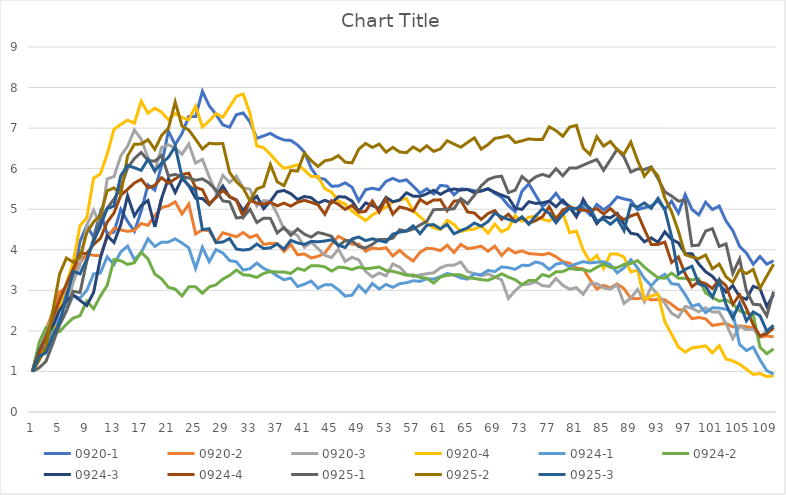
| Category | 0920-1 | 0920-2 | 0920-3 | 0920-4 | 0924-1 | 0924-2 | 0924-3 | 0924-4 | 0925-1 | 0925-2 | 0925-3 |
|---|---|---|---|---|---|---|---|---|---|---|---|
| 0 | 1 | 1 | 1 | 1 | 1 | 1 | 1 | 1 | 1 | 1 | 1 |
| 1 | 1.642 | 1.479 | 1.598 | 1.328 | 1.527 | 1.72 | 1.515 | 1.451 | 1.091 | 1.274 | 1.366 |
| 2 | 1.899 | 2.027 | 1.982 | 1.639 | 1.628 | 2.081 | 1.838 | 1.852 | 1.249 | 1.607 | 1.463 |
| 3 | 1.976 | 2.464 | 2.353 | 1.925 | 2.121 | 2.022 | 2.127 | 2.322 | 1.688 | 2.492 | 1.876 |
| 4 | 2.56 | 2.956 | 2.565 | 2.601 | 2.317 | 1.982 | 2.515 | 2.763 | 2.144 | 3.401 | 2.221 |
| 5 | 2.95 | 3.071 | 2.609 | 3.165 | 2.497 | 2.162 | 2.735 | 3.155 | 2.487 | 3.797 | 2.807 |
| 6 | 3.232 | 3.414 | 3.195 | 3.687 | 2.869 | 2.316 | 2.886 | 3.525 | 2.974 | 3.694 | 3.471 |
| 7 | 4.208 | 3.683 | 3.629 | 4.592 | 2.809 | 2.374 | 2.752 | 3.902 | 2.946 | 3.823 | 3.405 |
| 8 | 4.599 | 3.891 | 4.602 | 4.789 | 3 | 2.734 | 2.628 | 3.913 | 3.719 | 4.42 | 3.769 |
| 9 | 4.309 | 3.864 | 4.975 | 5.766 | 3.405 | 2.544 | 2.945 | 4.132 | 4.272 | 4.686 | 4.209 |
| 10 | 4.931 | 3.854 | 4.603 | 5.872 | 3.428 | 2.858 | 3.794 | 4.279 | 4.713 | 4.849 | 4.583 |
| 11 | 4.4 | 4.303 | 5.748 | 6.358 | 3.825 | 3.121 | 4.349 | 4.683 | 5.026 | 5.453 | 5.016 |
| 12 | 4.435 | 4.531 | 5.804 | 6.969 | 3.636 | 3.76 | 4.18 | 4.908 | 5.249 | 5.526 | 5.08 |
| 13 | 4.999 | 4.489 | 6.317 | 7.091 | 3.947 | 3.728 | 4.622 | 5.343 | 5.533 | 5.375 | 5.828 |
| 14 | 4.699 | 4.453 | 6.554 | 7.197 | 4.091 | 3.64 | 5.333 | 5.492 | 6.02 | 6.315 | 6.079 |
| 15 | 4.456 | 4.479 | 6.954 | 7.119 | 3.756 | 3.682 | 4.835 | 5.646 | 6.249 | 6.603 | 6.022 |
| 16 | 4.952 | 4.648 | 6.728 | 7.664 | 3.931 | 3.939 | 5.091 | 5.738 | 6.4 | 6.606 | 5.959 |
| 17 | 5.602 | 4.602 | 6.267 | 7.366 | 4.269 | 3.776 | 5.215 | 5.527 | 6.203 | 6.715 | 6.23 |
| 18 | 5.474 | 4.848 | 5.935 | 7.491 | 4.082 | 3.402 | 4.565 | 5.588 | 6.185 | 6.476 | 5.945 |
| 19 | 6.09 | 5.042 | 6.521 | 7.393 | 4.188 | 3.282 | 5.27 | 5.778 | 6.322 | 6.819 | 6.135 |
| 20 | 6.928 | 5.083 | 6.588 | 7.206 | 4.189 | 3.073 | 5.761 | 5.641 | 5.825 | 6.996 | 6.278 |
| 21 | 6.589 | 5.181 | 6.509 | 7.36 | 4.269 | 3.031 | 5.412 | 5.748 | 5.857 | 7.645 | 6.549 |
| 22 | 6.866 | 4.883 | 6.355 | 7.26 | 4.167 | 2.86 | 5.761 | 5.856 | 5.806 | 7.053 | 5.798 |
| 23 | 7.288 | 5.128 | 6.608 | 7.203 | 4.047 | 3.089 | 5.582 | 5.889 | 5.769 | 6.954 | 5.576 |
| 24 | 7.284 | 4.39 | 6.138 | 7.543 | 3.541 | 3.087 | 5.273 | 5.538 | 5.715 | 6.725 | 5.469 |
| 25 | 7.907 | 4.49 | 6.231 | 7.028 | 4.063 | 2.928 | 5.264 | 5.482 | 5.749 | 6.483 | 4.498 |
| 26 | 7.552 | 4.468 | 5.8 | 7.18 | 3.705 | 3.085 | 5.111 | 5.133 | 5.645 | 6.627 | 4.519 |
| 27 | 7.337 | 4.192 | 5.413 | 7.357 | 4.004 | 3.135 | 5.301 | 5.291 | 5.468 | 6.612 | 4.178 |
| 28 | 7.08 | 4.42 | 5.834 | 7.269 | 3.923 | 3.277 | 5.572 | 5.464 | 5.204 | 6.621 | 4.191 |
| 29 | 7.021 | 4.37 | 5.659 | 7.522 | 3.733 | 3.368 | 5.304 | 5.313 | 5.182 | 5.906 | 4.277 |
| 30 | 7.332 | 4.319 | 5.816 | 7.784 | 3.703 | 3.502 | 5.23 | 5.218 | 4.786 | 5.677 | 4.018 |
| 31 | 7.374 | 4.426 | 5.526 | 7.841 | 3.499 | 3.384 | 4.965 | 4.817 | 4.801 | 5.519 | 3.993 |
| 32 | 7.15 | 4.303 | 5.495 | 7.366 | 3.534 | 3.368 | 5.193 | 5.22 | 4.998 | 5.208 | 4.014 |
| 33 | 6.747 | 4.367 | 5.076 | 6.562 | 3.674 | 3.32 | 5.32 | 5.15 | 4.672 | 5.5 | 4.143 |
| 34 | 6.808 | 4.135 | 5.213 | 6.519 | 3.54 | 3.415 | 5.014 | 5.125 | 4.778 | 5.564 | 4.03 |
| 35 | 6.871 | 4.156 | 5.196 | 6.353 | 3.469 | 3.464 | 5.194 | 5.172 | 4.774 | 6.101 | 4.047 |
| 36 | 6.772 | 4.156 | 4.882 | 6.163 | 3.356 | 3.453 | 5.429 | 5.083 | 4.417 | 5.676 | 4.143 |
| 37 | 6.707 | 3.959 | 4.505 | 6.004 | 3.26 | 3.452 | 5.462 | 5.151 | 4.551 | 5.581 | 4.017 |
| 38 | 6.696 | 4.131 | 4.443 | 6.046 | 3.301 | 3.417 | 5.383 | 5.077 | 4.355 | 5.955 | 4.233 |
| 39 | 6.583 | 3.877 | 4.351 | 6.095 | 3.094 | 3.542 | 5.239 | 5.174 | 4.515 | 5.94 | 4.169 |
| 40 | 6.408 | 3.898 | 4.062 | 5.965 | 3.152 | 3.493 | 5.314 | 5.22 | 4.384 | 6.384 | 4.132 |
| 41 | 6.009 | 3.798 | 4.187 | 5.808 | 3.228 | 3.609 | 5.285 | 5.169 | 4.312 | 6.199 | 4.207 |
| 42 | 5.773 | 3.838 | 4.03 | 5.809 | 3.053 | 3.607 | 5.147 | 5.111 | 4.427 | 6.055 | 4.197 |
| 43 | 5.739 | 3.919 | 3.863 | 5.505 | 3.139 | 3.58 | 5.221 | 4.875 | 4.386 | 6.194 | 4.217 |
| 44 | 5.568 | 4.141 | 3.807 | 5.421 | 3.136 | 3.473 | 5.156 | 5.212 | 4.332 | 6.228 | 4.245 |
| 45 | 5.573 | 4.333 | 4.017 | 5.203 | 3.015 | 3.573 | 5.31 | 5.12 | 4.093 | 6.322 | 4.113 |
| 46 | 5.652 | 4.24 | 3.712 | 5.127 | 2.857 | 3.557 | 5.3 | 4.995 | 4.227 | 6.16 | 4.056 |
| 47 | 5.543 | 4.136 | 3.814 | 4.953 | 2.881 | 3.513 | 5.201 | 5.094 | 4.224 | 6.143 | 4.267 |
| 48 | 5.204 | 4.139 | 3.752 | 4.837 | 3.119 | 3.572 | 4.945 | 4.927 | 4.077 | 6.483 | 4.314 |
| 49 | 5.482 | 3.963 | 3.466 | 4.721 | 2.949 | 3.533 | 5.156 | 4.947 | 4.045 | 6.621 | 4.225 |
| 50 | 5.518 | 4.042 | 3.329 | 4.855 | 3.169 | 3.549 | 5.088 | 5.204 | 4.135 | 6.523 | 4.271 |
| 51 | 5.481 | 4.022 | 3.428 | 4.963 | 3.033 | 3.577 | 5.022 | 4.929 | 4.253 | 6.605 | 4.227 |
| 52 | 5.687 | 4.051 | 3.358 | 5.054 | 3.147 | 3.487 | 5.293 | 5.254 | 4.25 | 6.407 | 4.188 |
| 53 | 5.761 | 3.847 | 3.649 | 5.178 | 3.074 | 3.467 | 5.185 | 4.876 | 4.285 | 6.526 | 4.385 |
| 54 | 5.688 | 3.985 | 3.573 | 5.23 | 3.164 | 3.427 | 5.224 | 5.057 | 4.494 | 6.412 | 4.435 |
| 55 | 5.726 | 3.837 | 3.398 | 5.263 | 3.186 | 3.371 | 5.405 | 5.016 | 4.457 | 6.394 | 4.464 |
| 56 | 5.569 | 3.724 | 3.34 | 4.963 | 3.237 | 3.379 | 5.322 | 4.951 | 4.51 | 6.536 | 4.591 |
| 57 | 5.395 | 3.936 | 3.382 | 4.816 | 3.221 | 3.317 | 5.316 | 5.241 | 4.61 | 6.433 | 4.397 |
| 58 | 5.502 | 4.037 | 3.41 | 4.655 | 3.284 | 3.299 | 5.379 | 5.134 | 4.702 | 6.565 | 4.605 |
| 59 | 5.376 | 4.025 | 3.43 | 4.545 | 3.277 | 3.178 | 5.467 | 5.228 | 4.987 | 6.427 | 4.621 |
| 60 | 5.588 | 3.979 | 3.555 | 4.499 | 3.338 | 3.329 | 5.368 | 5.231 | 4.996 | 6.488 | 4.519 |
| 61 | 5.57 | 4.112 | 3.619 | 4.728 | 3.414 | 3.371 | 5.459 | 4.962 | 4.998 | 6.689 | 4.626 |
| 62 | 5.355 | 3.933 | 3.62 | 4.622 | 3.377 | 3.385 | 5.499 | 5.199 | 5.011 | 6.606 | 4.393 |
| 63 | 5.501 | 4.133 | 3.699 | 4.449 | 3.305 | 3.381 | 5.473 | 5.22 | 5.265 | 6.53 | 4.474 |
| 64 | 5.488 | 4.029 | 3.464 | 4.493 | 3.276 | 3.31 | 5.486 | 4.931 | 5.138 | 6.647 | 4.542 |
| 65 | 5.456 | 4.054 | 3.41 | 4.509 | 3.405 | 3.293 | 5.406 | 4.906 | 5.344 | 6.759 | 4.659 |
| 66 | 5.442 | 4.089 | 3.358 | 4.592 | 3.385 | 3.262 | 5.455 | 4.748 | 5.576 | 6.482 | 4.582 |
| 67 | 5.511 | 3.964 | 3.404 | 4.409 | 3.49 | 3.248 | 5.498 | 4.894 | 5.732 | 6.593 | 4.696 |
| 68 | 5.394 | 4.09 | 3.33 | 4.633 | 3.463 | 3.314 | 5.42 | 4.967 | 5.794 | 6.745 | 4.905 |
| 69 | 5.294 | 3.858 | 3.259 | 4.443 | 3.576 | 3.408 | 5.348 | 4.75 | 5.815 | 6.775 | 4.81 |
| 70 | 5.089 | 4.029 | 2.801 | 4.527 | 3.56 | 3.325 | 5.286 | 4.877 | 5.409 | 6.814 | 4.751 |
| 71 | 4.943 | 3.923 | 2.992 | 4.842 | 3.517 | 3.264 | 5.024 | 4.692 | 5.47 | 6.645 | 4.694 |
| 72 | 5.443 | 3.972 | 3.139 | 4.7 | 3.62 | 3.139 | 4.996 | 4.793 | 5.808 | 6.685 | 4.813 |
| 73 | 5.625 | 3.906 | 3.153 | 4.803 | 3.611 | 3.246 | 5.185 | 4.654 | 5.666 | 6.735 | 4.63 |
| 74 | 5.348 | 3.894 | 3.209 | 4.821 | 3.7 | 3.237 | 5.143 | 4.719 | 5.799 | 6.718 | 4.834 |
| 75 | 5.065 | 3.878 | 3.117 | 4.751 | 3.657 | 3.39 | 5.155 | 4.813 | 5.859 | 6.716 | 5.009 |
| 76 | 5.196 | 3.914 | 3.097 | 4.707 | 3.514 | 3.34 | 5.2 | 5.062 | 5.805 | 7.032 | 4.901 |
| 77 | 5.392 | 3.829 | 3.293 | 4.808 | 3.645 | 3.456 | 5.062 | 4.75 | 5.998 | 6.938 | 4.666 |
| 78 | 5.154 | 3.709 | 3.126 | 4.906 | 3.678 | 3.462 | 5.224 | 4.983 | 5.825 | 6.799 | 4.874 |
| 79 | 5.074 | 3.669 | 3.027 | 4.422 | 3.583 | 3.538 | 5.048 | 5.055 | 6.018 | 7.024 | 5.025 |
| 80 | 4.835 | 3.55 | 3.068 | 4.461 | 3.653 | 3.515 | 4.815 | 5.008 | 6.015 | 7.068 | 5.009 |
| 81 | 5.044 | 3.527 | 2.902 | 3.998 | 3.707 | 3.512 | 5.242 | 4.976 | 6.086 | 6.511 | 5.149 |
| 82 | 4.861 | 3.267 | 3.156 | 3.707 | 3.675 | 3.468 | 4.951 | 4.953 | 6.16 | 6.349 | 5.029 |
| 83 | 5.12 | 3.032 | 3.166 | 3.861 | 3.694 | 3.569 | 4.645 | 5.018 | 6.226 | 6.789 | 4.708 |
| 84 | 4.985 | 3.122 | 3.063 | 3.538 | 3.707 | 3.647 | 4.816 | 4.882 | 5.961 | 6.555 | 4.76 |
| 85 | 5.107 | 3.061 | 3.032 | 3.899 | 3.633 | 3.565 | 4.785 | 5.017 | 6.218 | 6.671 | 4.629 |
| 86 | 5.303 | 3.159 | 3.137 | 3.895 | 3.433 | 3.557 | 4.901 | 4.854 | 6.479 | 6.463 | 4.771 |
| 87 | 5.253 | 3.042 | 2.675 | 3.822 | 3.553 | 3.64 | 4.639 | 4.744 | 6.29 | 6.359 | 4.472 |
| 88 | 5.218 | 2.799 | 2.807 | 3.454 | 3.756 | 3.66 | 4.408 | 4.835 | 5.917 | 6.657 | 5.111 |
| 89 | 4.99 | 2.795 | 3.023 | 3.501 | 3.556 | 3.734 | 4.378 | 4.891 | 5.994 | 6.201 | 5.053 |
| 90 | 5.037 | 2.826 | 2.718 | 2.77 | 3.289 | 3.573 | 4.196 | 4.505 | 5.979 | 5.815 | 5.156 |
| 91 | 5.081 | 2.764 | 3.084 | 2.862 | 3.114 | 3.436 | 4.293 | 4.133 | 6.044 | 6.02 | 5.022 |
| 92 | 5.21 | 2.776 | 2.881 | 2.906 | 3.295 | 3.311 | 4.185 | 4.132 | 5.754 | 5.822 | 5.268 |
| 93 | 4.998 | 2.769 | 2.681 | 2.226 | 3.396 | 3.297 | 4.443 | 4.188 | 5.43 | 5.279 | 4.993 |
| 94 | 5.198 | 2.653 | 2.435 | 1.918 | 3.163 | 3.425 | 4.255 | 3.687 | 5.324 | 4.937 | 4.325 |
| 95 | 4.905 | 2.525 | 2.337 | 1.602 | 3.143 | 3.3 | 4.173 | 3.822 | 5.202 | 4.459 | 3.401 |
| 96 | 5.362 | 2.505 | 2.603 | 1.477 | 2.894 | 3.296 | 3.901 | 3.409 | 5.218 | 3.88 | 3.517 |
| 97 | 4.995 | 2.301 | 2.557 | 1.581 | 2.608 | 3.256 | 3.904 | 3.089 | 4.101 | 3.822 | 3.594 |
| 98 | 4.859 | 2.331 | 2.47 | 1.602 | 2.656 | 3.282 | 3.648 | 3.22 | 4.114 | 3.781 | 3.159 |
| 99 | 5.173 | 2.295 | 2.57 | 1.632 | 2.451 | 2.937 | 3.46 | 3.165 | 4.461 | 3.872 | 3.1 |
| 100 | 4.991 | 2.134 | 2.464 | 1.459 | 2.57 | 2.826 | 3.346 | 3.046 | 4.521 | 3.53 | 2.831 |
| 101 | 5.079 | 2.162 | 2.466 | 1.632 | 2.564 | 2.734 | 3.149 | 3.265 | 4.083 | 3.647 | 3.238 |
| 102 | 4.71 | 2.184 | 2.18 | 1.309 | 2.535 | 2.765 | 2.958 | 3.113 | 4.145 | 3.335 | 2.652 |
| 103 | 4.473 | 2.096 | 1.809 | 1.259 | 2.451 | 2.665 | 3.117 | 2.654 | 3.42 | 3.193 | 2.311 |
| 104 | 4.085 | 2.123 | 2.119 | 1.18 | 1.666 | 2.492 | 2.841 | 2.889 | 3.776 | 3.507 | 2.687 |
| 105 | 3.92 | 2.102 | 2.029 | 1.054 | 1.514 | 2.438 | 2.781 | 2.556 | 2.992 | 3.412 | 2.246 |
| 106 | 3.643 | 2.074 | 2.04 | 0.927 | 1.601 | 2.397 | 3.098 | 2.151 | 2.656 | 3.516 | 2.467 |
| 107 | 3.834 | 1.845 | 1.852 | 0.949 | 1.286 | 1.596 | 3.04 | 1.873 | 2.645 | 3.053 | 2.372 |
| 108 | 3.644 | 1.874 | 2.006 | 0.872 | 1.019 | 1.438 | 2.601 | 1.929 | 2.374 | 3.351 | 1.995 |
| 109 | 3.73 | 1.853 | 2.046 | 0.896 | 0.933 | 1.557 | 2.895 | 2.081 | 2.971 | 3.643 | 2.138 |